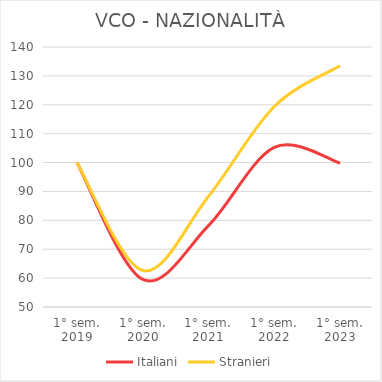
| Category | Italiani | Stranieri |
|---|---|---|
| 1° sem.
2019 | 100 | 100 |
| 1° sem.
2020 | 59.534 | 62.66 |
| 1° sem.
2021 | 78.175 | 88.314 |
| 1° sem.
2022 | 105.243 | 119.421 |
| 1° sem.
2023 | 99.799 | 133.5 |